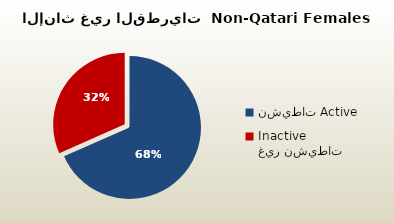
| Category | الاناث غير القطريات  Non-Qatari Females |
|---|---|
| نشيطات Active | 333294 |
| غير نشيطات Inactive | 153913 |